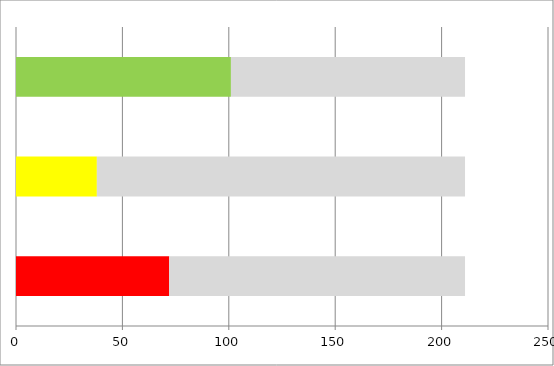
| Category | Series 0 | Series 1 |
|---|---|---|
| 0 | 72 | 139 |
| 1 | 38 | 173 |
| 2 | 101 | 110 |